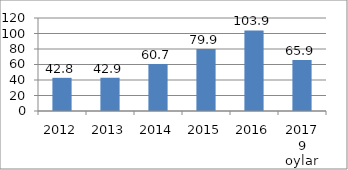
| Category | Series 0 |
|---|---|
| 2012 | 42.8 |
| 2013 | 42.9 |
| 2014 | 60.7 |
| 2015 | 79.9 |
| 2016 | 103.9 |
| 2017 9 oylar | 65.9 |